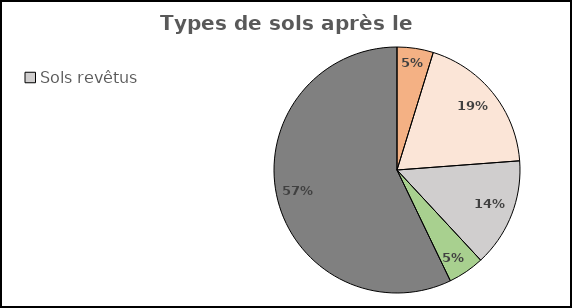
| Category | Series 0 |
|---|---|
| Sols en pleine terre | 5 |
| Sols apparents | 20 |
| Sols revêtus | 15 |
| Toitures végétalisées | 5 |
| Sols bâtis | 60 |